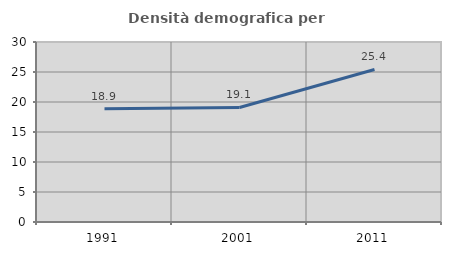
| Category | Densità demografica |
|---|---|
| 1991.0 | 18.867 |
| 2001.0 | 19.087 |
| 2011.0 | 25.422 |